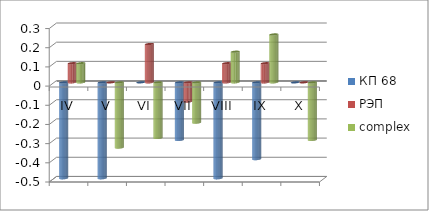
| Category | КП 68 | РЭП  | complex |
|---|---|---|---|
| IV | -0.5 | 0.1 | 0.1 |
| V | -0.5 | 0 | -0.34 |
| VI | 0 | 0.2 | -0.29 |
| VII | -0.3 | -0.1 | -0.21 |
| VIII | -0.5 | 0.1 | 0.16 |
| IX | -0.4 | 0.1 | 0.25 |
| X | 0 | 0 | -0.3 |